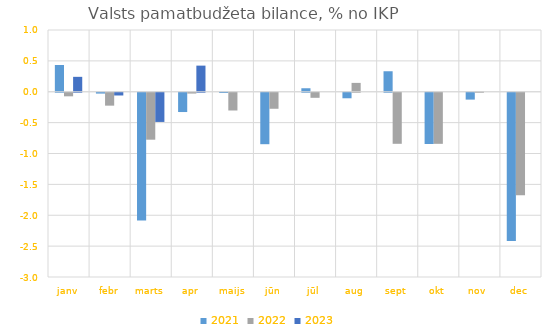
| Category | 2021 | 2022 | 2023 |
|---|---|---|---|
| janv | 0.433 | -0.058 | 0.241 |
| febr | -0.013 | -0.209 | -0.044 |
| marts | -2.068 | -0.76 | -0.473 |
| apr | -0.312 | -0.013 | 0.423 |
| maijs | -0.003 | -0.288 | 0 |
| jūn | -0.833 | -0.259 | 0 |
| jūl | 0.057 | -0.082 | 0 |
| aug | -0.089 | 0.143 | 0 |
| sept | 0.332 | -0.827 | 0 |
| okt | -0.83 | -0.827 | 0 |
| nov | -0.111 | 0.006 | 0 |
| dec | -2.399 | -1.661 | 0 |